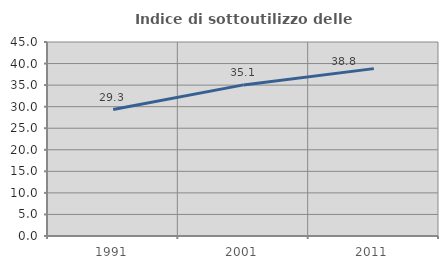
| Category | Indice di sottoutilizzo delle abitazioni  |
|---|---|
| 1991.0 | 29.326 |
| 2001.0 | 35.051 |
| 2011.0 | 38.824 |